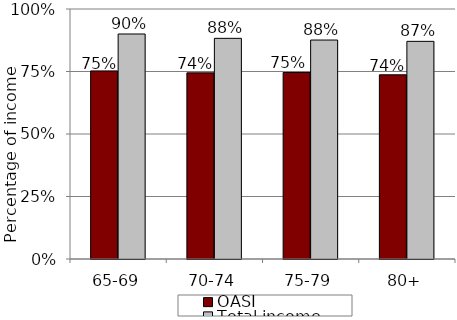
| Category | OASI | Total income |
|---|---|---|
| 65-69 | 0.752 | 0.9 |
| 70-74 | 0.745 | 0.883 |
| 75-79 | 0.746 | 0.876 |
| 80+ | 0.737 | 0.871 |